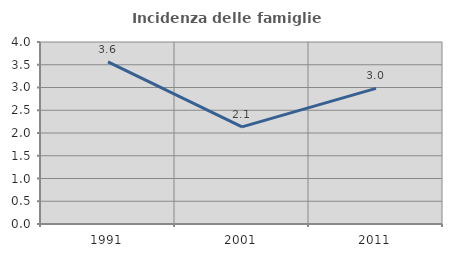
| Category | Incidenza delle famiglie numerose |
|---|---|
| 1991.0 | 3.564 |
| 2001.0 | 2.135 |
| 2011.0 | 2.98 |